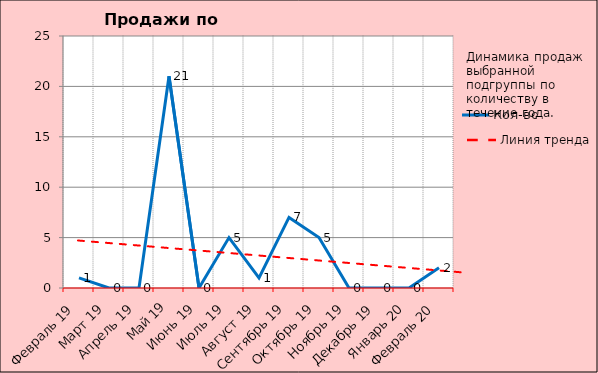
| Category | Кол-во |
|---|---|
|   Февраль 19 | 1 |
|   Март 19 | 0 |
|   Апрель 19 | 0 |
|   Май 19 | 21 |
|   Июнь 19 | 0 |
|   Июль 19 | 5 |
|   Август 19 | 1 |
|   Сентябрь 19 | 7 |
|   Октябрь 19 | 5 |
|   Ноябрь 19 | 0 |
|   Декабрь 19 | 0 |
|   Январь 20 | 0 |
|   Февраль 20 | 2 |